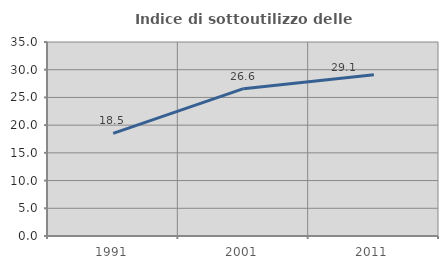
| Category | Indice di sottoutilizzo delle abitazioni  |
|---|---|
| 1991.0 | 18.519 |
| 2001.0 | 26.577 |
| 2011.0 | 29.076 |